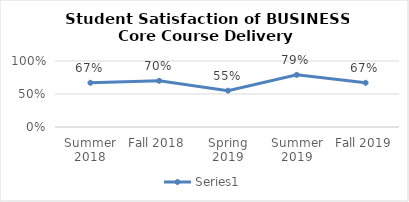
| Category | Series 0 |
|---|---|
| Summer 2018 | 0.67 |
| Fall 2018 | 0.7 |
| Spring 2019 | 0.55 |
| Summer 2019 | 0.79 |
| Fall 2019 | 0.67 |